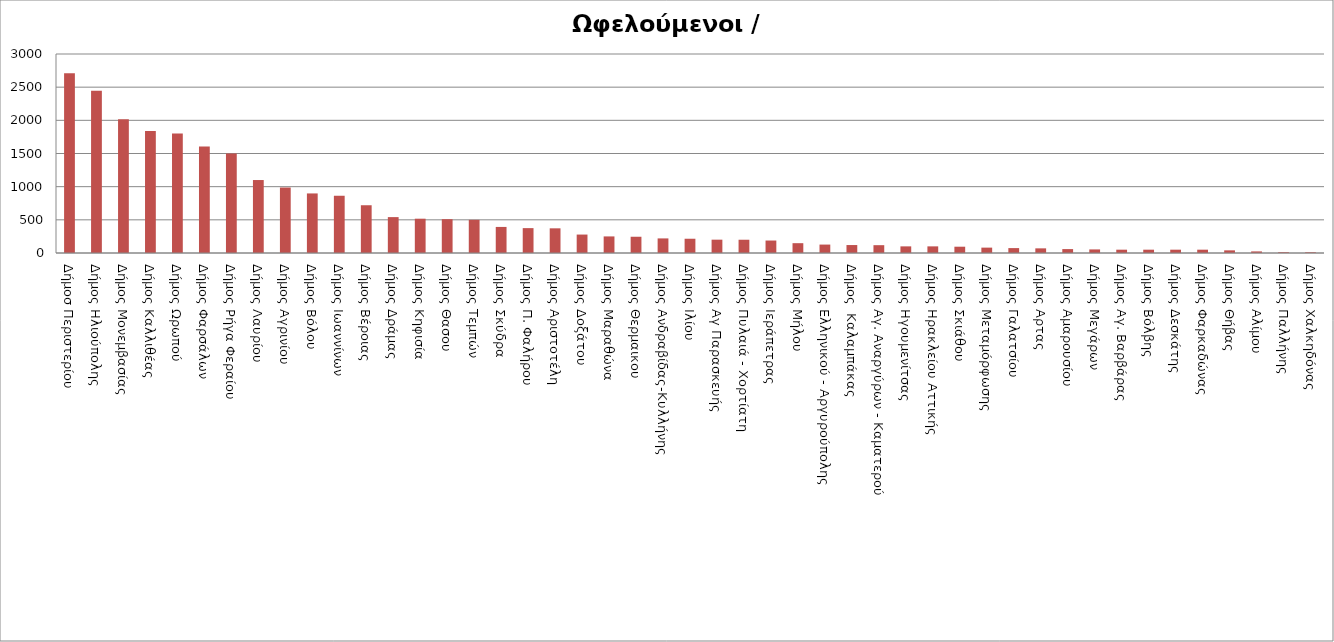
| Category | Series 0 |
|---|---|
| Δήμοσ Περιστερίου | 2708 |
| Δήμος Ηλιούπολης | 2445 |
| Δήμος Μονεμβασίας | 2018 |
| Δήμος Καλλιθέας | 1838 |
| Δήμος Ωρωπού | 1800 |
| Δήμος Φαρσάλων | 1606 |
| Δήμος Ρήγα Φεραίου | 1501 |
| Δήμος Λαυρίου | 1100 |
| Δήμος Αγρινίου | 987 |
| Δήμος Βόλου | 898 |
| Δήμος Ιωαννίνων  | 863 |
| Δήμος Βέροιας  | 720 |
| Δήμος Δράμας  | 541 |
| Δήμος Κηφισία  | 517 |
| Δήμος Θασου  | 510 |
| Δήμος Τεμπών | 500 |
| Δήμος Σκύδρα | 393 |
| Δήμος Π. Φαλήρου | 375 |
| Δήμος Αριστοτέλη | 372 |
| Δήμος Δοξάτου  | 278 |
| Δήμος Μαραθώνα | 250 |
| Δήμος Θερμαικου | 245 |
| Δήμος Ανδραβίδας-Κυλλήνης | 220 |
| Δήμος Ιλίου | 215 |
| Δήμος Αγ Παρασκευής | 201 |
| Δήμος Πυλαιά - Χορτίατη | 200 |
| Δήμος Ιεράπετρας | 188 |
| Δήμος Μήλου | 148 |
| Δήμος Ελληνικού - Αργυρούπολης | 127 |
| Δήμος  Καλαμπάκας  | 120 |
| Δήμος Αγ. Αναργύρων - Καματερού | 118 |
| Δήμος Ηγουμενίτσας | 100 |
| Δήμος Ηρακλείου Αττικής  | 100 |
| Δήμος Σκιάθου | 95 |
| Δήμος Μεταμόρφωσης | 81 |
| Δήμος Γαλατσίου | 74 |
| Δήμος Αρτας | 70 |
| Δήμος Αμαρουσίου | 59 |
| Δήμος Μεγάρων | 54 |
| Δήμος Αγ. Βαρβάρας  | 50 |
| Δήμος Βόλβης  | 50 |
| Δήμος Δεσκάτης  | 50 |
| Δήμος Φαρκαδώνας  | 50 |
| Δήμος Θήβας | 40 |
| Δήμος Αλίμου | 24 |
| Δήμος Παλλήνης | 12 |
| Δήμος Χαλκηδόνας | 11 |